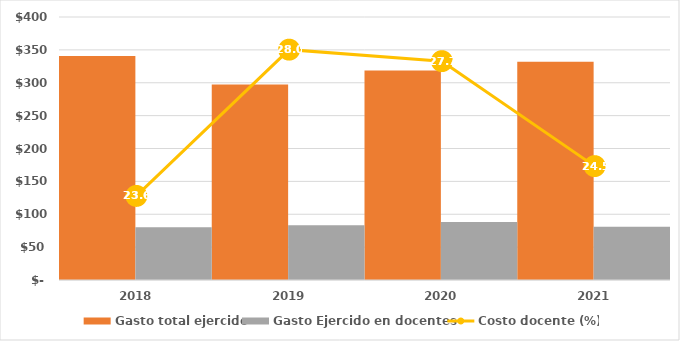
| Category | Gasto total ejercido | Gasto Ejercido en docentes |
|---|---|---|
| 2018 | 340765 | 80275.926 |
| 2019 | 297383.7 | 83288.235 |
| 2020 | 318785.247 | 88166.964 |
| 2021 | 331789.211 | 81169.717 |